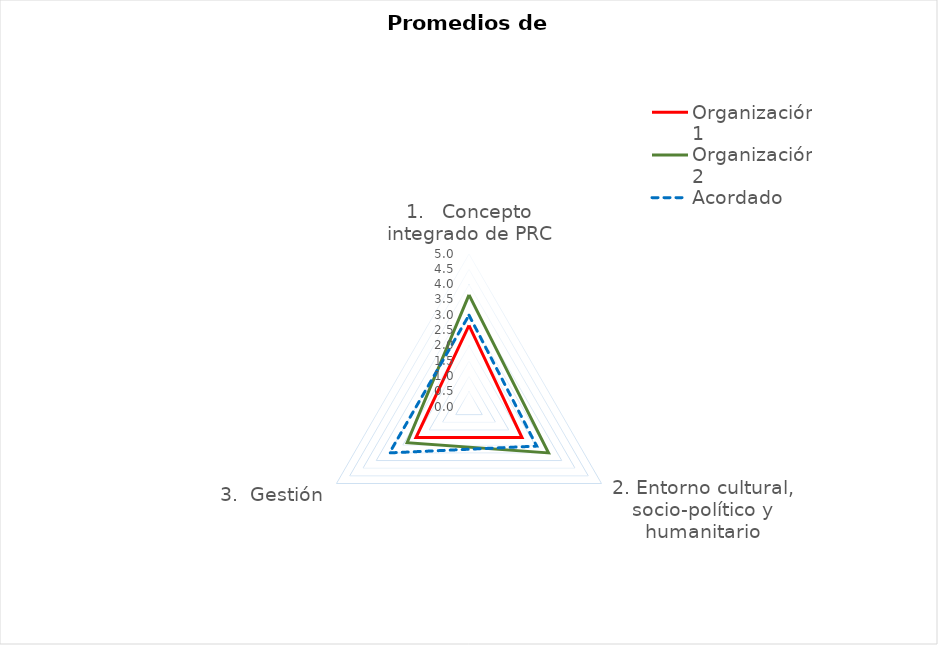
| Category | Organización 1 | Organización 2 | Acordado |
|---|---|---|---|
| 1.   Concepto integrado de PRC | 2.667 | 3.667 | 3 |
| 2. Entorno cultural, socio-político y humanitario | 2 | 3 | 2.556 |
| 3.  Gestión | 2 | 2.333 | 3 |